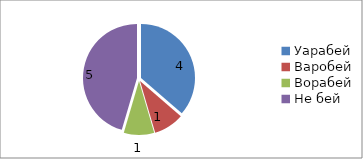
| Category | Series 0 |
|---|---|
| Уарабей | 4 |
| Варобей | 1 |
| Ворабей | 1 |
| Не бей | 5 |